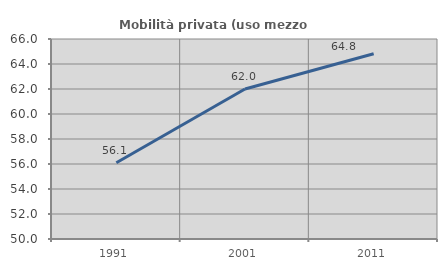
| Category | Mobilità privata (uso mezzo privato) |
|---|---|
| 1991.0 | 56.104 |
| 2001.0 | 62.005 |
| 2011.0 | 64.821 |